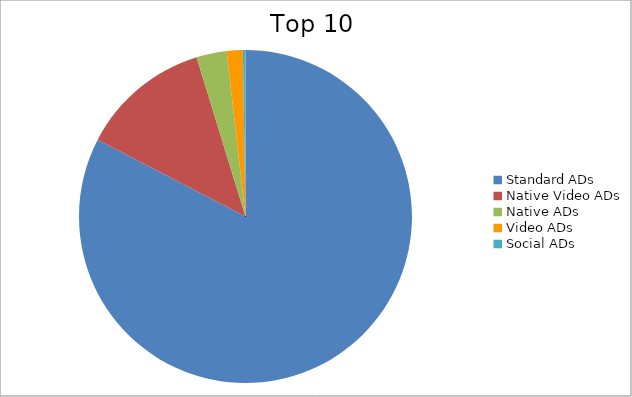
| Category | Series 0 |
|---|---|
| Standard ADs | 82.62 |
| Native Video ADs | 12.64 |
| Native ADs | 2.94 |
| Video ADs | 1.56 |
| Social ADs | 0.25 |